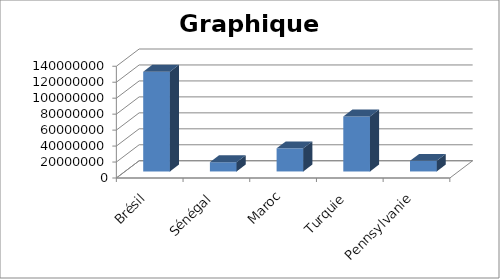
| Category | Series 0 |
|---|---|
| Brésil | 125000000 |
| Sénégal | 11555000 |
| Maroc | 28990365 |
| Turquie | 68888822 |
| Pennsylvanie | 13256410 |